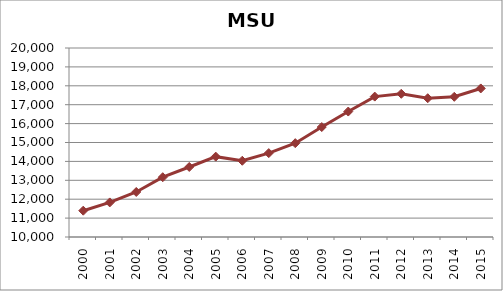
| Category | Series 0 |
|---|---|
| 2000.0 | 11391.842 |
| 2001.0 | 11828.958 |
| 2002.0 | 12382.175 |
| 2003.0 | 13162.9 |
| 2004.0 | 13704.583 |
| 2005.0 | 14251.667 |
| 2006.0 | 14034.2 |
| 2007.0 | 14437.867 |
| 2008.0 | 14964.492 |
| 2009.0 | 15816.942 |
| 2010.0 | 16638.075 |
| 2011.0 | 17428.083 |
| 2012.0 | 17577.2 |
| 2013.0 | 17342.175 |
| 2014.0 | 17418.133 |
| 2015.0 | 17859.9 |